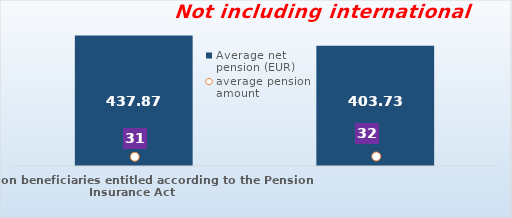
| Category | Average net pension (EUR)  |
|---|---|
| Pension beneficiaries entitled according to the Pension Insurance Act   | 437.87 |
| Pension beneficiaries entitled to pension FOR THE FIRST TIME in 2023 according to the Pension Insurance Act  - NEW BENEFICIARIES | 403.732 |